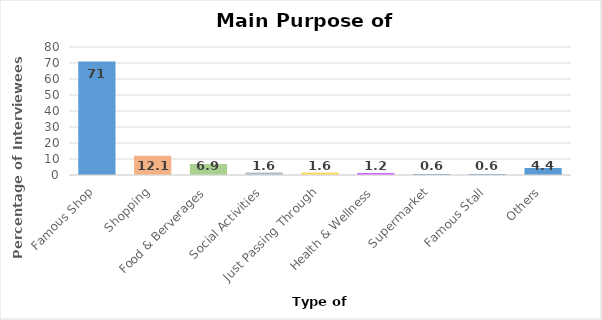
| Category | Series 0 |
|---|---|
| Famous Shop | 71 |
| Shopping | 12.1 |
| Food & Berverages | 6.9 |
| Social Activities | 1.6 |
| Just Passing Through | 1.6 |
| Health & Wellness | 1.2 |
| Supermarket | 0.6 |
| Famous Stall | 0.6 |
| Others | 4.4 |